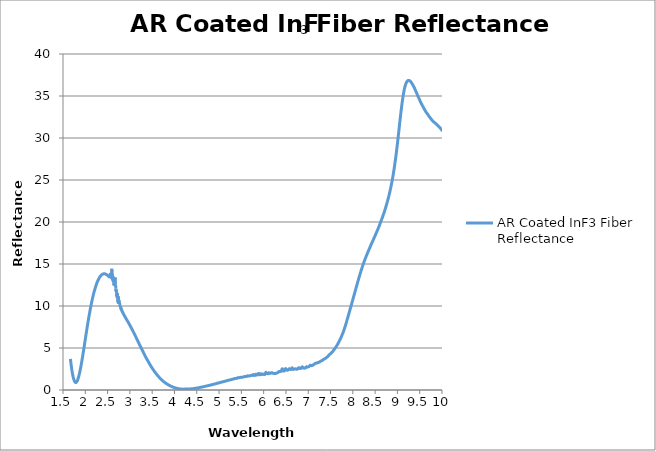
| Category | AR Coated InF3 Fiber Reflectance |
|---|---|
| 1.66628 | 3.701 |
| 1.6695 | 3.569 |
| 1.6727100000000001 | 3.409 |
| 1.6759300000000001 | 3.259 |
| 1.6791500000000001 | 3.143 |
| 1.6823599999999999 | 2.982 |
| 1.6855799999999999 | 2.879 |
| 1.6887999999999999 | 2.746 |
| 1.69201 | 2.619 |
| 1.69523 | 2.49 |
| 1.69845 | 2.388 |
| 1.7016600000000002 | 2.287 |
| 1.7048800000000002 | 2.175 |
| 1.7081 | 2.067 |
| 1.71132 | 1.975 |
| 1.7145299999999999 | 1.905 |
| 1.71775 | 1.801 |
| 1.72097 | 1.702 |
| 1.72418 | 1.633 |
| 1.7274 | 1.546 |
| 1.7306199999999998 | 1.501 |
| 1.73383 | 1.426 |
| 1.73705 | 1.347 |
| 1.74027 | 1.299 |
| 1.74348 | 1.248 |
| 1.7467000000000001 | 1.206 |
| 1.7499200000000001 | 1.151 |
| 1.75313 | 1.094 |
| 1.7563499999999999 | 1.063 |
| 1.7595699999999999 | 1.028 |
| 1.76278 | 0.995 |
| 1.766 | 0.966 |
| 1.76922 | 0.95 |
| 1.7724300000000002 | 0.932 |
| 1.7756500000000002 | 0.912 |
| 1.77887 | 0.912 |
| 1.7820799999999999 | 0.883 |
| 1.7852999999999999 | 0.899 |
| 1.7885199999999999 | 0.877 |
| 1.79173 | 0.906 |
| 1.79495 | 0.91 |
| 1.79817 | 0.922 |
| 1.8013800000000002 | 0.933 |
| 1.8046 | 0.943 |
| 1.80782 | 0.972 |
| 1.81103 | 1.008 |
| 1.81425 | 1.027 |
| 1.81747 | 1.056 |
| 1.82068 | 1.094 |
| 1.8239 | 1.133 |
| 1.8271199999999999 | 1.179 |
| 1.8303399999999999 | 1.22 |
| 1.83355 | 1.266 |
| 1.83677 | 1.327 |
| 1.83999 | 1.372 |
| 1.8432 | 1.424 |
| 1.8464200000000002 | 1.486 |
| 1.8496400000000002 | 1.552 |
| 1.8528499999999999 | 1.609 |
| 1.8560699999999999 | 1.682 |
| 1.8592899999999999 | 1.748 |
| 1.8625 | 1.811 |
| 1.86572 | 1.875 |
| 1.86894 | 1.962 |
| 1.87215 | 2.056 |
| 1.87537 | 2.113 |
| 1.87859 | 2.2 |
| 1.8818 | 2.272 |
| 1.88502 | 2.362 |
| 1.88824 | 2.437 |
| 1.89145 | 2.541 |
| 1.89467 | 2.603 |
| 1.89789 | 2.722 |
| 1.9011 | 2.811 |
| 1.90432 | 2.906 |
| 1.90754 | 2.992 |
| 1.91075 | 3.084 |
| 1.91397 | 3.191 |
| 1.91719 | 3.269 |
| 1.9204 | 3.41 |
| 1.9236199999999999 | 3.47 |
| 1.9268399999999999 | 3.58 |
| 1.93005 | 3.675 |
| 1.93327 | 3.78 |
| 1.93649 | 3.882 |
| 1.93971 | 3.994 |
| 1.94292 | 4.091 |
| 1.9461400000000002 | 4.19 |
| 1.94936 | 4.3 |
| 1.95257 | 4.415 |
| 1.95579 | 4.525 |
| 1.95901 | 4.626 |
| 1.96222 | 4.738 |
| 1.96544 | 4.85 |
| 1.96866 | 4.957 |
| 1.9718699999999998 | 5.081 |
| 1.97509 | 5.183 |
| 1.97831 | 5.285 |
| 1.98152 | 5.401 |
| 1.98474 | 5.511 |
| 1.98796 | 5.615 |
| 1.99117 | 5.737 |
| 1.99439 | 5.841 |
| 1.9976099999999999 | 5.956 |
| 2.00082 | 6.068 |
| 2.00404 | 6.178 |
| 2.00726 | 6.294 |
| 2.01047 | 6.41 |
| 2.01369 | 6.51 |
| 2.01691 | 6.612 |
| 2.02012 | 6.731 |
| 2.02334 | 6.845 |
| 2.02656 | 6.944 |
| 2.02977 | 7.058 |
| 2.03299 | 7.162 |
| 2.03621 | 7.264 |
| 2.0394200000000002 | 7.381 |
| 2.04264 | 7.496 |
| 2.04586 | 7.591 |
| 2.04907 | 7.699 |
| 2.05229 | 7.809 |
| 2.0555100000000004 | 7.896 |
| 2.05873 | 8.018 |
| 2.06194 | 8.113 |
| 2.0651599999999997 | 8.211 |
| 2.0683800000000003 | 8.318 |
| 2.07159 | 8.422 |
| 2.07481 | 8.518 |
| 2.07803 | 8.615 |
| 2.0812399999999998 | 8.719 |
| 2.08446 | 8.816 |
| 2.0876799999999998 | 8.915 |
| 2.09089 | 9.009 |
| 2.09411 | 9.106 |
| 2.09733 | 9.195 |
| 2.10054 | 9.296 |
| 2.1037600000000003 | 9.396 |
| 2.10698 | 9.486 |
| 2.1101900000000002 | 9.563 |
| 2.11341 | 9.67 |
| 2.1166300000000002 | 9.761 |
| 2.11984 | 9.853 |
| 2.1230599999999997 | 9.928 |
| 2.1262800000000004 | 10.018 |
| 2.1294899999999997 | 10.101 |
| 2.13271 | 10.188 |
| 2.1359299999999997 | 10.272 |
| 2.13914 | 10.358 |
| 2.14236 | 10.437 |
| 2.14558 | 10.514 |
| 2.14879 | 10.597 |
| 2.15201 | 10.675 |
| 2.15523 | 10.752 |
| 2.15844 | 10.832 |
| 2.16166 | 10.902 |
| 2.16488 | 10.979 |
| 2.1680900000000003 | 11.057 |
| 2.17131 | 11.134 |
| 2.1745300000000003 | 11.204 |
| 2.17775 | 11.274 |
| 2.1809600000000002 | 11.343 |
| 2.18418 | 11.405 |
| 2.1874000000000002 | 11.47 |
| 2.19061 | 11.542 |
| 2.1938299999999997 | 11.613 |
| 2.1970500000000004 | 11.669 |
| 2.20026 | 11.728 |
| 2.20348 | 11.802 |
| 2.2066999999999997 | 11.858 |
| 2.20991 | 11.924 |
| 2.21313 | 11.966 |
| 2.21635 | 12.027 |
| 2.21956 | 12.089 |
| 2.22278 | 12.138 |
| 2.226 | 12.201 |
| 2.22921 | 12.25 |
| 2.23243 | 12.31 |
| 2.23565 | 12.365 |
| 2.2388600000000003 | 12.412 |
| 2.24208 | 12.467 |
| 2.2453000000000003 | 12.512 |
| 2.24851 | 12.567 |
| 2.2517300000000002 | 12.612 |
| 2.25495 | 12.658 |
| 2.2581599999999997 | 12.706 |
| 2.26138 | 12.754 |
| 2.2645999999999997 | 12.801 |
| 2.26781 | 12.845 |
| 2.27103 | 12.883 |
| 2.27425 | 12.926 |
| 2.27746 | 12.966 |
| 2.28068 | 13.009 |
| 2.2839 | 13.044 |
| 2.28711 | 13.084 |
| 2.29033 | 13.117 |
| 2.29355 | 13.151 |
| 2.29677 | 13.182 |
| 2.29998 | 13.224 |
| 2.3032 | 13.254 |
| 2.30642 | 13.285 |
| 2.3096300000000003 | 13.313 |
| 2.31285 | 13.344 |
| 2.3160700000000003 | 13.365 |
| 2.31928 | 13.401 |
| 2.3225 | 13.431 |
| 2.32572 | 13.456 |
| 2.3289299999999997 | 13.481 |
| 2.33215 | 13.501 |
| 2.3353699999999997 | 13.531 |
| 2.33858 | 13.55 |
| 2.3418 | 13.569 |
| 2.34502 | 13.596 |
| 2.34823 | 13.61 |
| 2.35145 | 13.632 |
| 2.35467 | 13.649 |
| 2.35788 | 13.672 |
| 2.3611 | 13.688 |
| 2.36432 | 13.699 |
| 2.3675300000000004 | 13.711 |
| 2.37075 | 13.733 |
| 2.37397 | 13.743 |
| 2.3771799999999996 | 13.752 |
| 2.3804000000000003 | 13.766 |
| 2.38362 | 13.771 |
| 2.38683 | 13.784 |
| 2.39005 | 13.789 |
| 2.39327 | 13.798 |
| 2.39648 | 13.806 |
| 2.3996999999999997 | 13.815 |
| 2.40292 | 13.82 |
| 2.40613 | 13.821 |
| 2.40935 | 13.825 |
| 2.41257 | 13.835 |
| 2.41579 | 13.833 |
| 2.419 | 13.839 |
| 2.42222 | 13.84 |
| 2.42544 | 13.832 |
| 2.42865 | 13.834 |
| 2.43187 | 13.831 |
| 2.43509 | 13.832 |
| 2.4383000000000004 | 13.829 |
| 2.44152 | 13.824 |
| 2.44474 | 13.82 |
| 2.4479499999999996 | 13.813 |
| 2.4511700000000003 | 13.806 |
| 2.45439 | 13.796 |
| 2.4576 | 13.789 |
| 2.46082 | 13.785 |
| 2.46404 | 13.78 |
| 2.46725 | 13.766 |
| 2.4704699999999997 | 13.756 |
| 2.47369 | 13.754 |
| 2.4769 | 13.738 |
| 2.48012 | 13.728 |
| 2.48334 | 13.719 |
| 2.4865500000000003 | 13.709 |
| 2.48977 | 13.693 |
| 2.49299 | 13.676 |
| 2.4962 | 13.667 |
| 2.49942 | 13.641 |
| 2.50264 | 13.633 |
| 2.5058499999999997 | 13.623 |
| 2.5090700000000004 | 13.606 |
| 2.51229 | 13.583 |
| 2.5155 | 13.576 |
| 2.5187199999999996 | 13.564 |
| 2.52194 | 13.541 |
| 2.52515 | 13.528 |
| 2.52837 | 13.506 |
| 2.53159 | 13.55 |
| 2.53481 | 13.558 |
| 2.53802 | 13.501 |
| 2.5412399999999997 | 13.482 |
| 2.54446 | 13.543 |
| 2.54767 | 13.5 |
| 2.55089 | 13.538 |
| 2.55411 | 13.469 |
| 2.5573200000000003 | 13.308 |
| 2.56054 | 13.712 |
| 2.5637600000000003 | 13.943 |
| 2.56697 | 13.463 |
| 2.57019 | 13.562 |
| 2.57341 | 13.667 |
| 2.5766199999999997 | 13.58 |
| 2.5798400000000004 | 13.399 |
| 2.58306 | 13.732 |
| 2.58627 | 13.711 |
| 2.5894899999999996 | 13.451 |
| 2.59271 | 13.685 |
| 2.59592 | 14.429 |
| 2.59914 | 13.191 |
| 2.60236 | 13.358 |
| 2.60557 | 13.821 |
| 2.60879 | 13.426 |
| 2.61201 | 13.075 |
| 2.61522 | 13.259 |
| 2.61844 | 13.577 |
| 2.62166 | 13.221 |
| 2.62487 | 12.901 |
| 2.6280900000000003 | 13.229 |
| 2.63131 | 13.319 |
| 2.63452 | 12.831 |
| 2.63774 | 12.492 |
| 2.64096 | 12.469 |
| 2.64418 | 12.535 |
| 2.6473899999999997 | 12.484 |
| 2.65061 | 12.428 |
| 2.65383 | 12.602 |
| 2.65704 | 12.436 |
| 2.66026 | 12.508 |
| 2.66348 | 12.755 |
| 2.66669 | 13.401 |
| 2.66991 | 13.318 |
| 2.67313 | 12.654 |
| 2.67634 | 12.703 |
| 2.67956 | 12.565 |
| 2.68278 | 12.065 |
| 2.68599 | 11.972 |
| 2.68921 | 11.744 |
| 2.69243 | 11.876 |
| 2.69564 | 11.987 |
| 2.6988600000000003 | 11.491 |
| 2.70208 | 11.399 |
| 2.7052899999999998 | 11.179 |
| 2.7085100000000004 | 11.418 |
| 2.71173 | 11.538 |
| 2.71494 | 10.936 |
| 2.7181599999999997 | 11.111 |
| 2.72138 | 11.537 |
| 2.72459 | 11.294 |
| 2.72781 | 10.688 |
| 2.73103 | 10.428 |
| 2.73424 | 10.591 |
| 2.73746 | 10.797 |
| 2.74068 | 11.171 |
| 2.74389 | 10.549 |
| 2.74711 | 10.236 |
| 2.75033 | 10.24 |
| 2.75354 | 10.541 |
| 2.7567600000000003 | 10.721 |
| 2.75998 | 10.264 |
| 2.7632 | 10.402 |
| 2.76641 | 10.332 |
| 2.7696300000000003 | 10.328 |
| 2.77285 | 10.162 |
| 2.7760599999999998 | 9.969 |
| 2.7792800000000004 | 9.974 |
| 2.7825 | 9.959 |
| 2.78571 | 10.017 |
| 2.7889299999999997 | 10.005 |
| 2.79215 | 9.761 |
| 2.79536 | 9.694 |
| 2.79858 | 9.667 |
| 2.8018 | 9.811 |
| 2.8050100000000002 | 9.826 |
| 2.80823 | 9.608 |
| 2.81145 | 9.518 |
| 2.81466 | 9.516 |
| 2.81788 | 9.512 |
| 2.8211 | 9.49 |
| 2.82431 | 9.382 |
| 2.8275300000000003 | 9.343 |
| 2.83075 | 9.307 |
| 2.8339600000000003 | 9.316 |
| 2.83718 | 9.296 |
| 2.8404000000000003 | 9.228 |
| 2.84361 | 9.162 |
| 2.8468299999999997 | 9.141 |
| 2.85005 | 9.134 |
| 2.85326 | 9.113 |
| 2.85648 | 9.072 |
| 2.8596999999999997 | 9.017 |
| 2.86291 | 8.978 |
| 2.86613 | 8.953 |
| 2.86935 | 8.929 |
| 2.87256 | 8.905 |
| 2.8757800000000002 | 8.855 |
| 2.879 | 8.824 |
| 2.88222 | 8.798 |
| 2.88543 | 8.775 |
| 2.88865 | 8.746 |
| 2.89187 | 8.704 |
| 2.89508 | 8.672 |
| 2.8983000000000003 | 8.658 |
| 2.90152 | 8.65 |
| 2.90473 | 8.604 |
| 2.90795 | 8.558 |
| 2.9111700000000003 | 8.524 |
| 2.91438 | 8.496 |
| 2.9175999999999997 | 8.466 |
| 2.92082 | 8.447 |
| 2.92403 | 8.426 |
| 2.92725 | 8.384 |
| 2.9304699999999997 | 8.351 |
| 2.93368 | 8.327 |
| 2.9369 | 8.299 |
| 2.94012 | 8.272 |
| 2.94333 | 8.244 |
| 2.9465500000000002 | 8.214 |
| 2.94977 | 8.181 |
| 2.95298 | 8.152 |
| 2.9562 | 8.127 |
| 2.95942 | 8.093 |
| 2.9626300000000003 | 8.061 |
| 2.96585 | 8.032 |
| 2.9690700000000003 | 8.007 |
| 2.97228 | 7.981 |
| 2.9755 | 7.95 |
| 2.9787199999999996 | 7.918 |
| 2.9819299999999997 | 7.885 |
| 2.98515 | 7.852 |
| 2.9883699999999997 | 7.818 |
| 2.99158 | 7.785 |
| 2.9948 | 7.759 |
| 2.99802 | 7.731 |
| 3.0012399999999997 | 7.695 |
| 3.00445 | 7.662 |
| 3.00767 | 7.629 |
| 3.01089 | 7.597 |
| 3.0141 | 7.568 |
| 3.0173200000000002 | 7.541 |
| 3.02054 | 7.511 |
| 3.02375 | 7.478 |
| 3.02697 | 7.441 |
| 3.03019 | 7.41 |
| 3.0334 | 7.381 |
| 3.03662 | 7.347 |
| 3.0398400000000003 | 7.31 |
| 3.04305 | 7.274 |
| 3.04627 | 7.243 |
| 3.0494899999999996 | 7.214 |
| 3.0526999999999997 | 7.183 |
| 3.05592 | 7.151 |
| 3.0591399999999997 | 7.113 |
| 3.06235 | 7.075 |
| 3.06557 | 7.037 |
| 3.06879 | 7.006 |
| 3.072 | 6.976 |
| 3.07522 | 6.939 |
| 3.07844 | 6.906 |
| 3.0816500000000002 | 6.878 |
| 3.08487 | 6.84 |
| 3.0880900000000002 | 6.804 |
| 3.0913000000000004 | 6.772 |
| 3.09452 | 6.74 |
| 3.09774 | 6.705 |
| 3.1009499999999997 | 6.665 |
| 3.10417 | 6.633 |
| 3.1073899999999997 | 6.605 |
| 3.1106 | 6.57 |
| 3.11382 | 6.532 |
| 3.11704 | 6.493 |
| 3.12026 | 6.458 |
| 3.1234699999999997 | 6.428 |
| 3.12669 | 6.398 |
| 3.1299099999999997 | 6.362 |
| 3.13312 | 6.324 |
| 3.13634 | 6.288 |
| 3.13956 | 6.251 |
| 3.14277 | 6.213 |
| 3.14599 | 6.184 |
| 3.14921 | 6.151 |
| 3.15242 | 6.112 |
| 3.15564 | 6.078 |
| 3.1588600000000002 | 6.044 |
| 3.1620700000000004 | 6.005 |
| 3.16529 | 5.968 |
| 3.1685100000000004 | 5.937 |
| 3.1717199999999997 | 5.902 |
| 3.17494 | 5.863 |
| 3.1781599999999997 | 5.824 |
| 3.18137 | 5.788 |
| 3.18459 | 5.755 |
| 3.18781 | 5.723 |
| 3.19102 | 5.694 |
| 3.1942399999999997 | 5.66 |
| 3.19746 | 5.62 |
| 3.20067 | 5.584 |
| 3.20389 | 5.552 |
| 3.20711 | 5.517 |
| 3.2103200000000003 | 5.474 |
| 3.21354 | 5.434 |
| 3.2167600000000003 | 5.398 |
| 3.21997 | 5.361 |
| 3.22319 | 5.329 |
| 3.22641 | 5.3 |
| 3.2296199999999997 | 5.266 |
| 3.23284 | 5.226 |
| 3.23606 | 5.187 |
| 3.2392800000000004 | 5.151 |
| 3.2424899999999997 | 5.117 |
| 3.24571 | 5.084 |
| 3.2489299999999997 | 5.047 |
| 3.25214 | 5.011 |
| 3.25536 | 4.98 |
| 3.25858 | 4.948 |
| 3.26179 | 4.914 |
| 3.26501 | 4.876 |
| 3.26823 | 4.839 |
| 3.27144 | 4.803 |
| 3.27466 | 4.765 |
| 3.27788 | 4.731 |
| 3.2810900000000003 | 4.697 |
| 3.28431 | 4.662 |
| 3.2875300000000003 | 4.628 |
| 3.29074 | 4.595 |
| 3.29396 | 4.563 |
| 3.29718 | 4.529 |
| 3.3003899999999997 | 4.492 |
| 3.30361 | 4.454 |
| 3.3068299999999997 | 4.417 |
| 3.31004 | 4.385 |
| 3.31326 | 4.358 |
| 3.31648 | 4.327 |
| 3.31969 | 4.293 |
| 3.32291 | 4.259 |
| 3.32613 | 4.222 |
| 3.32934 | 4.182 |
| 3.33256 | 4.146 |
| 3.33578 | 4.114 |
| 3.33899 | 4.08 |
| 3.34221 | 4.044 |
| 3.34543 | 4.011 |
| 3.34864 | 3.98 |
| 3.3518600000000003 | 3.946 |
| 3.35508 | 3.913 |
| 3.3583000000000003 | 3.882 |
| 3.36151 | 3.85 |
| 3.36473 | 3.816 |
| 3.36795 | 3.785 |
| 3.3711599999999997 | 3.759 |
| 3.37438 | 3.735 |
| 3.3775999999999997 | 3.712 |
| 3.38081 | 3.686 |
| 3.38403 | 3.656 |
| 3.38725 | 3.622 |
| 3.39046 | 3.586 |
| 3.39368 | 3.551 |
| 3.3969 | 3.519 |
| 3.40011 | 3.487 |
| 3.40333 | 3.456 |
| 3.40655 | 3.429 |
| 3.4097600000000003 | 3.401 |
| 3.41298 | 3.372 |
| 3.4162 | 3.345 |
| 3.41941 | 3.318 |
| 3.4226300000000003 | 3.288 |
| 3.42585 | 3.254 |
| 3.4290599999999998 | 3.22 |
| 3.43228 | 3.189 |
| 3.4355 | 3.16 |
| 3.43871 | 3.132 |
| 3.4419299999999997 | 3.105 |
| 3.44515 | 3.075 |
| 3.44836 | 3.042 |
| 3.45158 | 3.013 |
| 3.4548 | 2.989 |
| 3.4580100000000003 | 2.962 |
| 3.46123 | 2.93 |
| 3.46445 | 2.902 |
| 3.46767 | 2.876 |
| 3.47088 | 2.848 |
| 3.4741 | 2.819 |
| 3.47732 | 2.793 |
| 3.4805300000000003 | 2.767 |
| 3.48375 | 2.74 |
| 3.48697 | 2.713 |
| 3.4901799999999996 | 2.685 |
| 3.4934000000000003 | 2.659 |
| 3.49662 | 2.636 |
| 3.4998299999999998 | 2.61 |
| 3.50305 | 2.582 |
| 3.5062699999999998 | 2.556 |
| 3.50948 | 2.53 |
| 3.5126999999999997 | 2.504 |
| 3.51592 | 2.48 |
| 3.51913 | 2.457 |
| 3.52235 | 2.43 |
| 3.52557 | 2.404 |
| 3.5287800000000002 | 2.378 |
| 3.532 | 2.351 |
| 3.53522 | 2.326 |
| 3.53843 | 2.304 |
| 3.54165 | 2.282 |
| 3.54487 | 2.257 |
| 3.54808 | 2.234 |
| 3.5513000000000003 | 2.211 |
| 3.55452 | 2.188 |
| 3.55773 | 2.162 |
| 3.5609499999999996 | 2.137 |
| 3.5641700000000003 | 2.114 |
| 3.56738 | 2.094 |
| 3.5705999999999998 | 2.071 |
| 3.57382 | 2.047 |
| 3.57703 | 2.027 |
| 3.58025 | 2.006 |
| 3.5834699999999997 | 1.98 |
| 3.58669 | 1.957 |
| 3.5899 | 1.936 |
| 3.59312 | 1.916 |
| 3.59634 | 1.895 |
| 3.5995500000000002 | 1.873 |
| 3.60277 | 1.852 |
| 3.60599 | 1.831 |
| 3.6092 | 1.81 |
| 3.61242 | 1.788 |
| 3.61564 | 1.765 |
| 3.61885 | 1.745 |
| 3.6220700000000003 | 1.725 |
| 3.62529 | 1.705 |
| 3.6285 | 1.686 |
| 3.6317199999999996 | 1.667 |
| 3.63494 | 1.646 |
| 3.63815 | 1.626 |
| 3.6413699999999998 | 1.608 |
| 3.64459 | 1.589 |
| 3.6478 | 1.568 |
| 3.65102 | 1.548 |
| 3.6542399999999997 | 1.528 |
| 3.65745 | 1.508 |
| 3.66067 | 1.491 |
| 3.66389 | 1.474 |
| 3.6671 | 1.455 |
| 3.6703200000000002 | 1.437 |
| 3.67354 | 1.419 |
| 3.67675 | 1.401 |
| 3.67997 | 1.384 |
| 3.68319 | 1.369 |
| 3.6864 | 1.351 |
| 3.6896199999999997 | 1.331 |
| 3.6928400000000003 | 1.314 |
| 3.69605 | 1.3 |
| 3.69927 | 1.286 |
| 3.7024899999999996 | 1.269 |
| 3.70571 | 1.251 |
| 3.70892 | 1.232 |
| 3.7121399999999998 | 1.214 |
| 3.71536 | 1.194 |
| 3.71857 | 1.176 |
| 3.72179 | 1.161 |
| 3.72501 | 1.148 |
| 3.72822 | 1.135 |
| 3.73144 | 1.12 |
| 3.73466 | 1.104 |
| 3.73787 | 1.089 |
| 3.7410900000000002 | 1.075 |
| 3.74431 | 1.061 |
| 3.74752 | 1.046 |
| 3.75074 | 1.032 |
| 3.75396 | 1.02 |
| 3.75717 | 1.005 |
| 3.7603899999999997 | 0.988 |
| 3.7636100000000003 | 0.972 |
| 3.76682 | 0.959 |
| 3.77004 | 0.948 |
| 3.77326 | 0.938 |
| 3.7764699999999998 | 0.925 |
| 3.77969 | 0.909 |
| 3.7829099999999998 | 0.894 |
| 3.78612 | 0.883 |
| 3.78934 | 0.871 |
| 3.79256 | 0.857 |
| 3.79577 | 0.843 |
| 3.79899 | 0.831 |
| 3.80221 | 0.819 |
| 3.8054200000000002 | 0.808 |
| 3.80864 | 0.797 |
| 3.8118600000000002 | 0.786 |
| 3.81507 | 0.774 |
| 3.81829 | 0.761 |
| 3.8215100000000004 | 0.748 |
| 3.82473 | 0.736 |
| 3.82794 | 0.725 |
| 3.8311599999999997 | 0.714 |
| 3.83438 | 0.703 |
| 3.83759 | 0.691 |
| 3.84081 | 0.679 |
| 3.84403 | 0.67 |
| 3.8472399999999998 | 0.662 |
| 3.85046 | 0.653 |
| 3.8536799999999998 | 0.644 |
| 3.85689 | 0.635 |
| 3.86011 | 0.625 |
| 3.86333 | 0.615 |
| 3.86654 | 0.603 |
| 3.8697600000000003 | 0.592 |
| 3.87298 | 0.581 |
| 3.8761900000000002 | 0.571 |
| 3.87941 | 0.561 |
| 3.8826300000000002 | 0.553 |
| 3.88584 | 0.544 |
| 3.8890599999999997 | 0.536 |
| 3.8922800000000004 | 0.529 |
| 3.8954899999999997 | 0.521 |
| 3.89871 | 0.512 |
| 3.9019299999999997 | 0.501 |
| 3.90514 | 0.489 |
| 3.90836 | 0.479 |
| 3.91158 | 0.47 |
| 3.91479 | 0.462 |
| 3.91801 | 0.454 |
| 3.92123 | 0.448 |
| 3.92444 | 0.444 |
| 3.92766 | 0.437 |
| 3.93088 | 0.427 |
| 3.9340900000000003 | 0.416 |
| 3.93731 | 0.408 |
| 3.9405300000000003 | 0.401 |
| 3.94375 | 0.394 |
| 3.9469600000000002 | 0.388 |
| 3.95018 | 0.381 |
| 3.9534000000000002 | 0.374 |
| 3.95661 | 0.367 |
| 3.9598299999999997 | 0.361 |
| 3.96305 | 0.354 |
| 3.96626 | 0.346 |
| 3.96948 | 0.339 |
| 3.9726999999999997 | 0.333 |
| 3.97591 | 0.328 |
| 3.97913 | 0.323 |
| 3.98235 | 0.315 |
| 3.98556 | 0.307 |
| 3.98878 | 0.298 |
| 3.992 | 0.292 |
| 3.99521 | 0.287 |
| 3.99843 | 0.284 |
| 4.00165 | 0.281 |
| 4.00486 | 0.276 |
| 4.00808 | 0.27 |
| 4.0113 | 0.263 |
| 4.0145100000000005 | 0.258 |
| 4.01773 | 0.255 |
| 4.02095 | 0.251 |
| 4.02416 | 0.245 |
| 4.02738 | 0.236 |
| 4.0306 | 0.228 |
| 4.03381 | 0.224 |
| 4.037030000000001 | 0.22 |
| 4.04025 | 0.216 |
| 4.04346 | 0.212 |
| 4.04668 | 0.208 |
| 4.0499 | 0.204 |
| 4.05311 | 0.2 |
| 4.05633 | 0.197 |
| 4.05955 | 0.193 |
| 4.0627699999999995 | 0.19 |
| 4.06598 | 0.187 |
| 4.0691999999999995 | 0.182 |
| 4.07242 | 0.176 |
| 4.07563 | 0.173 |
| 4.07885 | 0.17 |
| 4.08207 | 0.165 |
| 4.08528 | 0.161 |
| 4.0885 | 0.159 |
| 4.09172 | 0.157 |
| 4.09493 | 0.155 |
| 4.0981499999999995 | 0.151 |
| 4.10137 | 0.145 |
| 4.10458 | 0.141 |
| 4.1078 | 0.137 |
| 4.111020000000001 | 0.135 |
| 4.114229999999999 | 0.133 |
| 4.11745 | 0.131 |
| 4.1206700000000005 | 0.129 |
| 4.12388 | 0.127 |
| 4.1271 | 0.124 |
| 4.130319999999999 | 0.122 |
| 4.1335299999999995 | 0.121 |
| 4.13675 | 0.119 |
| 4.13997 | 0.117 |
| 4.14318 | 0.115 |
| 4.1464 | 0.114 |
| 4.14962 | 0.114 |
| 4.15283 | 0.114 |
| 4.1560500000000005 | 0.114 |
| 4.15927 | 0.114 |
| 4.1624799999999995 | 0.113 |
| 4.1657 | 0.109 |
| 4.16892 | 0.106 |
| 4.172140000000001 | 0.103 |
| 4.175350000000001 | 0.103 |
| 4.17857 | 0.103 |
| 4.18179 | 0.103 |
| 4.185 | 0.103 |
| 4.18822 | 0.101 |
| 4.191439999999999 | 0.101 |
| 4.194649999999999 | 0.101 |
| 4.19787 | 0.101 |
| 4.20109 | 0.1 |
| 4.2043 | 0.1 |
| 4.207520000000001 | 0.1 |
| 4.2107399999999995 | 0.102 |
| 4.21395 | 0.105 |
| 4.21717 | 0.108 |
| 4.22039 | 0.112 |
| 4.2236 | 0.114 |
| 4.22682 | 0.114 |
| 4.23004 | 0.115 |
| 4.23325 | 0.116 |
| 4.236470000000001 | 0.118 |
| 4.2396899999999995 | 0.12 |
| 4.2429 | 0.119 |
| 4.2461199999999995 | 0.115 |
| 4.24934 | 0.109 |
| 4.25255 | 0.103 |
| 4.25577 | 0.099 |
| 4.25899 | 0.1 |
| 4.2622 | 0.103 |
| 4.26542 | 0.109 |
| 4.26864 | 0.113 |
| 4.271850000000001 | 0.116 |
| 4.2750699999999995 | 0.115 |
| 4.27829 | 0.114 |
| 4.2815 | 0.112 |
| 4.28472 | 0.111 |
| 4.28794 | 0.113 |
| 4.29116 | 0.115 |
| 4.29437 | 0.117 |
| 4.2975900000000005 | 0.118 |
| 4.30081 | 0.117 |
| 4.30402 | 0.115 |
| 4.30724 | 0.116 |
| 4.31046 | 0.117 |
| 4.31367 | 0.118 |
| 4.31689 | 0.119 |
| 4.32011 | 0.12 |
| 4.32332 | 0.122 |
| 4.32654 | 0.122 |
| 4.32976 | 0.122 |
| 4.33297 | 0.122 |
| 4.336189999999999 | 0.122 |
| 4.33941 | 0.123 |
| 4.34262 | 0.122 |
| 4.34584 | 0.121 |
| 4.349060000000001 | 0.123 |
| 4.352270000000001 | 0.125 |
| 4.35549 | 0.128 |
| 4.35871 | 0.129 |
| 4.3619200000000005 | 0.131 |
| 4.36514 | 0.132 |
| 4.36836 | 0.134 |
| 4.371569999999999 | 0.137 |
| 4.37479 | 0.139 |
| 4.378010000000001 | 0.14 |
| 4.38122 | 0.141 |
| 4.38444 | 0.143 |
| 4.3876599999999994 | 0.146 |
| 4.39087 | 0.149 |
| 4.39409 | 0.152 |
| 4.39731 | 0.153 |
| 4.40052 | 0.154 |
| 4.40374 | 0.155 |
| 4.40696 | 0.156 |
| 4.41018 | 0.158 |
| 4.413390000000001 | 0.16 |
| 4.4166099999999995 | 0.161 |
| 4.41983 | 0.161 |
| 4.42304 | 0.162 |
| 4.42626 | 0.162 |
| 4.42948 | 0.164 |
| 4.43269 | 0.166 |
| 4.43591 | 0.17 |
| 4.4391300000000005 | 0.173 |
| 4.44234 | 0.176 |
| 4.44556 | 0.18 |
| 4.44878 | 0.184 |
| 4.4519899999999994 | 0.188 |
| 4.45521 | 0.192 |
| 4.45843 | 0.195 |
| 4.46164 | 0.196 |
| 4.46486 | 0.197 |
| 4.46808 | 0.199 |
| 4.47129 | 0.201 |
| 4.47451 | 0.204 |
| 4.477729999999999 | 0.208 |
| 4.4809399999999995 | 0.211 |
| 4.48416 | 0.212 |
| 4.48738 | 0.214 |
| 4.49059 | 0.217 |
| 4.493810000000001 | 0.221 |
| 4.49703 | 0.224 |
| 4.50024 | 0.226 |
| 4.5034600000000005 | 0.229 |
| 4.50668 | 0.232 |
| 4.50989 | 0.236 |
| 4.513109999999999 | 0.24 |
| 4.51633 | 0.244 |
| 4.51954 | 0.248 |
| 4.52276 | 0.251 |
| 4.52598 | 0.253 |
| 4.5291999999999994 | 0.256 |
| 4.53241 | 0.259 |
| 4.53563 | 0.263 |
| 4.53885 | 0.267 |
| 4.54206 | 0.269 |
| 4.54528 | 0.272 |
| 4.5485 | 0.274 |
| 4.55171 | 0.277 |
| 4.554930000000001 | 0.28 |
| 4.5581499999999995 | 0.284 |
| 4.56136 | 0.288 |
| 4.56458 | 0.291 |
| 4.5678 | 0.296 |
| 4.57101 | 0.301 |
| 4.574229999999999 | 0.307 |
| 4.57745 | 0.312 |
| 4.58066 | 0.316 |
| 4.58388 | 0.318 |
| 4.5871 | 0.319 |
| 4.590310000000001 | 0.322 |
| 4.5935299999999994 | 0.326 |
| 4.59675 | 0.332 |
| 4.59996 | 0.336 |
| 4.60318 | 0.34 |
| 4.6064 | 0.343 |
| 4.60961 | 0.346 |
| 4.61283 | 0.348 |
| 4.61605 | 0.35 |
| 4.619260000000001 | 0.353 |
| 4.6224799999999995 | 0.357 |
| 4.6257 | 0.361 |
| 4.628909999999999 | 0.364 |
| 4.63213 | 0.367 |
| 4.635350000000001 | 0.371 |
| 4.63856 | 0.375 |
| 4.64178 | 0.38 |
| 4.645 | 0.384 |
| 4.64822 | 0.389 |
| 4.65143 | 0.393 |
| 4.654649999999999 | 0.398 |
| 4.65787 | 0.401 |
| 4.66108 | 0.405 |
| 4.6643 | 0.408 |
| 4.667520000000001 | 0.412 |
| 4.67073 | 0.416 |
| 4.67395 | 0.42 |
| 4.67717 | 0.423 |
| 4.68038 | 0.427 |
| 4.6836 | 0.43 |
| 4.68682 | 0.434 |
| 4.69003 | 0.439 |
| 4.69325 | 0.444 |
| 4.696470000000001 | 0.449 |
| 4.69968 | 0.454 |
| 4.7029 | 0.459 |
| 4.70612 | 0.464 |
| 4.70933 | 0.469 |
| 4.71255 | 0.474 |
| 4.71577 | 0.478 |
| 4.718979999999999 | 0.481 |
| 4.7222 | 0.483 |
| 4.72542 | 0.485 |
| 4.72863 | 0.488 |
| 4.7318500000000006 | 0.491 |
| 4.7350699999999994 | 0.496 |
| 4.73828 | 0.501 |
| 4.7415 | 0.506 |
| 4.74472 | 0.511 |
| 4.74793 | 0.515 |
| 4.75115 | 0.518 |
| 4.75437 | 0.521 |
| 4.75758 | 0.523 |
| 4.760800000000001 | 0.528 |
| 4.76402 | 0.532 |
| 4.76724 | 0.537 |
| 4.770449999999999 | 0.542 |
| 4.77367 | 0.545 |
| 4.776890000000001 | 0.549 |
| 4.7801 | 0.552 |
| 4.78332 | 0.555 |
| 4.78654 | 0.559 |
| 4.78975 | 0.562 |
| 4.79297 | 0.566 |
| 4.796189999999999 | 0.57 |
| 4.7993999999999994 | 0.576 |
| 4.80262 | 0.582 |
| 4.80584 | 0.587 |
| 4.80905 | 0.59 |
| 4.812270000000001 | 0.594 |
| 4.81549 | 0.597 |
| 4.8187 | 0.601 |
| 4.82192 | 0.607 |
| 4.82514 | 0.612 |
| 4.82835 | 0.617 |
| 4.83157 | 0.621 |
| 4.83479 | 0.624 |
| 4.838 | 0.628 |
| 4.84122 | 0.632 |
| 4.84444 | 0.636 |
| 4.84765 | 0.641 |
| 4.85087 | 0.647 |
| 4.85409 | 0.652 |
| 4.8573 | 0.656 |
| 4.86052 | 0.66 |
| 4.86374 | 0.662 |
| 4.86695 | 0.665 |
| 4.87017 | 0.669 |
| 4.8733900000000006 | 0.673 |
| 4.8766099999999994 | 0.678 |
| 4.87982 | 0.683 |
| 4.88304 | 0.688 |
| 4.88626 | 0.694 |
| 4.88947 | 0.7 |
| 4.89269 | 0.705 |
| 4.89591 | 0.71 |
| 4.89912 | 0.714 |
| 4.902340000000001 | 0.717 |
| 4.90556 | 0.721 |
| 4.9087700000000005 | 0.725 |
| 4.911989999999999 | 0.73 |
| 4.91521 | 0.735 |
| 4.91842 | 0.741 |
| 4.92164 | 0.747 |
| 4.92486 | 0.752 |
| 4.92807 | 0.756 |
| 4.93129 | 0.759 |
| 4.93451 | 0.761 |
| 4.9377200000000006 | 0.764 |
| 4.940939999999999 | 0.768 |
| 4.94416 | 0.774 |
| 4.94737 | 0.781 |
| 4.95059 | 0.788 |
| 4.953810000000001 | 0.794 |
| 4.957020000000001 | 0.799 |
| 4.96024 | 0.804 |
| 4.96346 | 0.808 |
| 4.96667 | 0.813 |
| 4.96989 | 0.817 |
| 4.973109999999999 | 0.822 |
| 4.976319999999999 | 0.826 |
| 4.97954 | 0.829 |
| 4.98276 | 0.832 |
| 4.98597 | 0.835 |
| 4.98919 | 0.84 |
| 4.99241 | 0.844 |
| 4.99563 | 0.849 |
| 4.99884 | 0.854 |
| 5.00206 | 0.858 |
| 5.00528 | 0.862 |
| 5.00849 | 0.866 |
| 5.01171 | 0.871 |
| 5.0149300000000006 | 0.877 |
| 5.018140000000001 | 0.883 |
| 5.02136 | 0.889 |
| 5.02458 | 0.893 |
| 5.0277899999999995 | 0.897 |
| 5.03101 | 0.901 |
| 5.03423 | 0.906 |
| 5.037439999999999 | 0.912 |
| 5.04066 | 0.918 |
| 5.04388 | 0.922 |
| 5.04709 | 0.925 |
| 5.0503100000000005 | 0.928 |
| 5.053529999999999 | 0.931 |
| 5.05674 | 0.935 |
| 5.05996 | 0.939 |
| 5.06318 | 0.944 |
| 5.06639 | 0.949 |
| 5.06961 | 0.955 |
| 5.07283 | 0.962 |
| 5.07604 | 0.969 |
| 5.0792600000000006 | 0.974 |
| 5.082479999999999 | 0.978 |
| 5.08569 | 0.981 |
| 5.08891 | 0.983 |
| 5.09213 | 0.987 |
| 5.09534 | 0.99 |
| 5.09856 | 0.995 |
| 5.10178 | 1 |
| 5.10499 | 1.005 |
| 5.10821 | 1.009 |
| 5.11143 | 1.014 |
| 5.114649999999999 | 1.019 |
| 5.117859999999999 | 1.024 |
| 5.12108 | 1.029 |
| 5.1243 | 1.033 |
| 5.12751 | 1.037 |
| 5.13073 | 1.041 |
| 5.13395 | 1.045 |
| 5.13716 | 1.051 |
| 5.14038 | 1.057 |
| 5.1436 | 1.063 |
| 5.14681 | 1.068 |
| 5.15003 | 1.072 |
| 5.15325 | 1.074 |
| 5.15646 | 1.077 |
| 5.159680000000001 | 1.08 |
| 5.1629 | 1.085 |
| 5.16611 | 1.09 |
| 5.1693299999999995 | 1.096 |
| 5.17255 | 1.101 |
| 5.17576 | 1.105 |
| 5.178979999999999 | 1.109 |
| 5.1822 | 1.113 |
| 5.18541 | 1.117 |
| 5.18863 | 1.122 |
| 5.1918500000000005 | 1.128 |
| 5.195060000000001 | 1.133 |
| 5.19828 | 1.138 |
| 5.2015 | 1.144 |
| 5.20471 | 1.149 |
| 5.20793 | 1.155 |
| 5.21115 | 1.16 |
| 5.21436 | 1.165 |
| 5.21758 | 1.169 |
| 5.2208000000000006 | 1.171 |
| 5.22401 | 1.175 |
| 5.22723 | 1.178 |
| 5.230449999999999 | 1.183 |
| 5.23367 | 1.188 |
| 5.23688 | 1.193 |
| 5.2401 | 1.198 |
| 5.24332 | 1.202 |
| 5.24653 | 1.206 |
| 5.24975 | 1.21 |
| 5.25297 | 1.215 |
| 5.2561800000000005 | 1.219 |
| 5.259399999999999 | 1.224 |
| 5.26262 | 1.228 |
| 5.26583 | 1.232 |
| 5.26905 | 1.236 |
| 5.272270000000001 | 1.24 |
| 5.27548 | 1.244 |
| 5.2787 | 1.248 |
| 5.28192 | 1.252 |
| 5.2851300000000005 | 1.257 |
| 5.28835 | 1.263 |
| 5.29157 | 1.269 |
| 5.294779999999999 | 1.274 |
| 5.298 | 1.278 |
| 5.30122 | 1.282 |
| 5.30443 | 1.285 |
| 5.30765 | 1.288 |
| 5.3108699999999995 | 1.292 |
| 5.31408 | 1.296 |
| 5.3173 | 1.3 |
| 5.32052 | 1.303 |
| 5.323729999999999 | 1.307 |
| 5.32695 | 1.311 |
| 5.33017 | 1.315 |
| 5.33338 | 1.32 |
| 5.336600000000001 | 1.328 |
| 5.33982 | 1.337 |
| 5.34303 | 1.349 |
| 5.34625 | 1.361 |
| 5.34947 | 1.37 |
| 5.35269 | 1.376 |
| 5.355899999999999 | 1.376 |
| 5.35912 | 1.372 |
| 5.3623400000000006 | 1.367 |
| 5.36555 | 1.365 |
| 5.3687700000000005 | 1.364 |
| 5.371989999999999 | 1.367 |
| 5.3751999999999995 | 1.37 |
| 5.37842 | 1.375 |
| 5.38164 | 1.379 |
| 5.38485 | 1.383 |
| 5.38807 | 1.388 |
| 5.39129 | 1.392 |
| 5.3945 | 1.396 |
| 5.3977200000000005 | 1.4 |
| 5.400939999999999 | 1.405 |
| 5.40415 | 1.412 |
| 5.40737 | 1.42 |
| 5.41059 | 1.432 |
| 5.4138 | 1.445 |
| 5.417020000000001 | 1.459 |
| 5.42024 | 1.468 |
| 5.42345 | 1.473 |
| 5.42667 | 1.469 |
| 5.42989 | 1.462 |
| 5.4331000000000005 | 1.454 |
| 5.436319999999999 | 1.448 |
| 5.43954 | 1.446 |
| 5.44275 | 1.447 |
| 5.44597 | 1.451 |
| 5.44919 | 1.457 |
| 5.4524 | 1.464 |
| 5.45562 | 1.474 |
| 5.45884 | 1.485 |
| 5.4620500000000005 | 1.495 |
| 5.46527 | 1.502 |
| 5.46849 | 1.507 |
| 5.47171 | 1.509 |
| 5.47492 | 1.509 |
| 5.478140000000001 | 1.508 |
| 5.48136 | 1.507 |
| 5.48457 | 1.504 |
| 5.48779 | 1.502 |
| 5.49101 | 1.5 |
| 5.49422 | 1.499 |
| 5.497439999999999 | 1.5 |
| 5.50066 | 1.503 |
| 5.50387 | 1.506 |
| 5.50709 | 1.511 |
| 5.5103100000000005 | 1.516 |
| 5.513520000000001 | 1.521 |
| 5.5167399999999995 | 1.527 |
| 5.51996 | 1.531 |
| 5.52317 | 1.535 |
| 5.52639 | 1.536 |
| 5.52961 | 1.536 |
| 5.53282 | 1.535 |
| 5.53604 | 1.536 |
| 5.5392600000000005 | 1.537 |
| 5.542470000000001 | 1.542 |
| 5.54569 | 1.548 |
| 5.54891 | 1.555 |
| 5.5521199999999995 | 1.562 |
| 5.55534 | 1.566 |
| 5.558560000000001 | 1.57 |
| 5.56177 | 1.574 |
| 5.56499 | 1.579 |
| 5.56821 | 1.589 |
| 5.57142 | 1.6 |
| 5.5746400000000005 | 1.612 |
| 5.577859999999999 | 1.62 |
| 5.5810699999999995 | 1.625 |
| 5.58429 | 1.62 |
| 5.58751 | 1.614 |
| 5.59073 | 1.608 |
| 5.59394 | 1.601 |
| 5.59716 | 1.601 |
| 5.60038 | 1.601 |
| 5.6035900000000005 | 1.602 |
| 5.60681 | 1.604 |
| 5.61003 | 1.606 |
| 5.613239999999999 | 1.609 |
| 5.61646 | 1.611 |
| 5.619680000000001 | 1.614 |
| 5.62289 | 1.619 |
| 5.62611 | 1.627 |
| 5.6293299999999995 | 1.638 |
| 5.63254 | 1.653 |
| 5.63576 | 1.671 |
| 5.638979999999999 | 1.686 |
| 5.642189999999999 | 1.7 |
| 5.64541 | 1.7 |
| 5.64863 | 1.698 |
| 5.65184 | 1.687 |
| 5.655060000000001 | 1.675 |
| 5.6582799999999995 | 1.666 |
| 5.66149 | 1.658 |
| 5.66471 | 1.657 |
| 5.66793 | 1.658 |
| 5.67114 | 1.664 |
| 5.67436 | 1.67 |
| 5.67758 | 1.675 |
| 5.68079 | 1.679 |
| 5.68401 | 1.681 |
| 5.68723 | 1.682 |
| 5.69044 | 1.683 |
| 5.6936599999999995 | 1.686 |
| 5.69688 | 1.69 |
| 5.7001 | 1.697 |
| 5.70331 | 1.708 |
| 5.70653 | 1.72 |
| 5.70975 | 1.733 |
| 5.71296 | 1.741 |
| 5.7161800000000005 | 1.745 |
| 5.719399999999999 | 1.743 |
| 5.7226099999999995 | 1.738 |
| 5.72583 | 1.734 |
| 5.72905 | 1.73 |
| 5.73226 | 1.731 |
| 5.73548 | 1.733 |
| 5.7387 | 1.739 |
| 5.74191 | 1.746 |
| 5.7451300000000005 | 1.753 |
| 5.74835 | 1.759 |
| 5.7515600000000004 | 1.769 |
| 5.754779999999999 | 1.78 |
| 5.758 | 1.798 |
| 5.76121 | 1.818 |
| 5.76443 | 1.832 |
| 5.76765 | 1.844 |
| 5.77086 | 1.833 |
| 5.77408 | 1.819 |
| 5.7773 | 1.795 |
| 5.7805100000000005 | 1.77 |
| 5.783729999999999 | 1.753 |
| 5.78695 | 1.737 |
| 5.79016 | 1.73 |
| 5.79338 | 1.724 |
| 5.796600000000001 | 1.725 |
| 5.799810000000001 | 1.726 |
| 5.80303 | 1.735 |
| 5.80625 | 1.746 |
| 5.80946 | 1.769 |
| 5.81268 | 1.794 |
| 5.8159 | 1.823 |
| 5.81912 | 1.853 |
| 5.82233 | 1.866 |
| 5.82555 | 1.874 |
| 5.8287700000000005 | 1.862 |
| 5.83198 | 1.843 |
| 5.8351999999999995 | 1.821 |
| 5.83842 | 1.798 |
| 5.84163 | 1.783 |
| 5.84485 | 1.772 |
| 5.84807 | 1.771 |
| 5.85128 | 1.776 |
| 5.8545 | 1.785 |
| 5.8577200000000005 | 1.797 |
| 5.860930000000001 | 1.812 |
| 5.8641499999999995 | 1.827 |
| 5.86737 | 1.847 |
| 5.87058 | 1.872 |
| 5.8738 | 1.898 |
| 5.877020000000001 | 1.927 |
| 5.880229999999999 | 1.952 |
| 5.88345 | 1.965 |
| 5.8866700000000005 | 1.972 |
| 5.88988 | 1.961 |
| 5.8931000000000004 | 1.948 |
| 5.896319999999999 | 1.923 |
| 5.8995299999999995 | 1.898 |
| 5.90275 | 1.871 |
| 5.90597 | 1.843 |
| 5.90918 | 1.827 |
| 5.9124 | 1.81 |
| 5.91562 | 1.811 |
| 5.91883 | 1.814 |
| 5.9220500000000005 | 1.833 |
| 5.92527 | 1.855 |
| 5.9284799999999995 | 1.884 |
| 5.9317 | 1.916 |
| 5.93492 | 1.934 |
| 5.938140000000001 | 1.944 |
| 5.941350000000001 | 1.938 |
| 5.94457 | 1.914 |
| 5.94779 | 1.891 |
| 5.951 | 1.867 |
| 5.95422 | 1.848 |
| 5.957439999999999 | 1.846 |
| 5.960649999999999 | 1.845 |
| 5.96387 | 1.856 |
| 5.96709 | 1.867 |
| 5.9703 | 1.875 |
| 5.973520000000001 | 1.883 |
| 5.9767399999999995 | 1.887 |
| 5.97995 | 1.89 |
| 5.98317 | 1.893 |
| 5.98639 | 1.895 |
| 5.9896 | 1.893 |
| 5.99282 | 1.887 |
| 5.99604 | 1.879 |
| 5.99925 | 1.868 |
| 6.002470000000001 | 1.859 |
| 6.0056899999999995 | 1.856 |
| 6.0089 | 1.853 |
| 6.0121199999999995 | 1.854 |
| 6.01534 | 1.855 |
| 6.01855 | 1.853 |
| 6.02177 | 1.85 |
| 6.02499 | 1.852 |
| 6.0282 | 1.855 |
| 6.03142 | 1.874 |
| 6.0346400000000004 | 1.903 |
| 6.037850000000001 | 1.942 |
| 6.0410699999999995 | 1.996 |
| 6.04429 | 2.046 |
| 6.0475 | 2.077 |
| 6.05072 | 2.109 |
| 6.05394 | 2.09 |
| 6.05716 | 2.072 |
| 6.06037 | 2.05 |
| 6.0635900000000005 | 2.027 |
| 6.06681 | 2.014 |
| 6.07002 | 2.008 |
| 6.07324 | 2.001 |
| 6.07646 | 1.991 |
| 6.07967 | 1.98 |
| 6.08289 | 1.961 |
| 6.08611 | 1.943 |
| 6.08932 | 1.935 |
| 6.09254 | 1.928 |
| 6.09576 | 1.936 |
| 6.0989700000000004 | 1.95 |
| 6.102189999999999 | 1.971 |
| 6.10541 | 1.999 |
| 6.10862 | 2.024 |
| 6.11184 | 2.04 |
| 6.115060000000001 | 2.054 |
| 6.118270000000001 | 2.041 |
| 6.12149 | 2.028 |
| 6.12471 | 2.01 |
| 6.1279200000000005 | 1.99 |
| 6.13114 | 1.979 |
| 6.13436 | 1.974 |
| 6.137569999999999 | 1.973 |
| 6.14079 | 1.981 |
| 6.144010000000001 | 1.989 |
| 6.14722 | 1.999 |
| 6.15044 | 2.01 |
| 6.1536599999999995 | 2.017 |
| 6.15687 | 2.022 |
| 6.16009 | 2.025 |
| 6.16331 | 2.024 |
| 6.16652 | 2.024 |
| 6.16974 | 2.027 |
| 6.17296 | 2.03 |
| 6.1761800000000004 | 2.042 |
| 6.179390000000001 | 2.055 |
| 6.1826099999999995 | 2.063 |
| 6.18583 | 2.068 |
| 6.18904 | 2.066 |
| 6.19226 | 2.051 |
| 6.19548 | 2.036 |
| 6.19869 | 2.019 |
| 6.20191 | 2.002 |
| 6.2051300000000005 | 1.993 |
| 6.20834 | 1.987 |
| 6.21156 | 1.983 |
| 6.214779999999999 | 1.982 |
| 6.2179899999999995 | 1.981 |
| 6.22121 | 1.979 |
| 6.22443 | 1.978 |
| 6.22764 | 1.977 |
| 6.23086 | 1.975 |
| 6.23408 | 1.974 |
| 6.23729 | 1.973 |
| 6.2405100000000004 | 1.971 |
| 6.243729999999999 | 1.97 |
| 6.2469399999999995 | 1.968 |
| 6.25016 | 1.967 |
| 6.25338 | 1.967 |
| 6.25659 | 1.967 |
| 6.259810000000001 | 1.969 |
| 6.26303 | 1.97 |
| 6.26624 | 1.973 |
| 6.2694600000000005 | 1.977 |
| 6.27268 | 1.981 |
| 6.27589 | 1.986 |
| 6.279109999999999 | 1.991 |
| 6.28233 | 1.997 |
| 6.28554 | 2.004 |
| 6.28876 | 2.011 |
| 6.29198 | 2.019 |
| 6.2951999999999995 | 2.027 |
| 6.29841 | 2.035 |
| 6.30163 | 2.042 |
| 6.30485 | 2.049 |
| 6.30806 | 2.055 |
| 6.31128 | 2.061 |
| 6.3145 | 2.066 |
| 6.31771 | 2.072 |
| 6.320930000000001 | 2.08 |
| 6.3241499999999995 | 2.088 |
| 6.32736 | 2.104 |
| 6.33058 | 2.12 |
| 6.3338 | 2.142 |
| 6.33701 | 2.166 |
| 6.340229999999999 | 2.186 |
| 6.34345 | 2.197 |
| 6.34666 | 2.209 |
| 6.34988 | 2.205 |
| 6.3531 | 2.199 |
| 6.356310000000001 | 2.196 |
| 6.3595299999999995 | 2.193 |
| 6.36275 | 2.192 |
| 6.36596 | 2.198 |
| 6.36918 | 2.204 |
| 6.3724 | 2.207 |
| 6.37561 | 2.209 |
| 6.37883 | 2.21 |
| 6.3820500000000004 | 2.208 |
| 6.385260000000001 | 2.205 |
| 6.3884799999999995 | 2.213 |
| 6.3917 | 2.224 |
| 6.394909999999999 | 2.243 |
| 6.39813 | 2.283 |
| 6.401350000000001 | 2.322 |
| 6.40457 | 2.378 |
| 6.40778 | 2.436 |
| 6.411 | 2.481 |
| 6.41422 | 2.506 |
| 6.41743 | 2.53 |
| 6.420649999999999 | 2.502 |
| 6.42387 | 2.47 |
| 6.42708 | 2.434 |
| 6.4303 | 2.391 |
| 6.433520000000001 | 2.349 |
| 6.43673 | 2.322 |
| 6.43995 | 2.296 |
| 6.44317 | 2.277 |
| 6.44638 | 2.266 |
| 6.4496 | 2.254 |
| 6.45282 | 2.253 |
| 6.45603 | 2.252 |
| 6.45925 | 2.259 |
| 6.462470000000001 | 2.271 |
| 6.46568 | 2.284 |
| 6.4689 | 2.315 |
| 6.47212 | 2.345 |
| 6.47533 | 2.383 |
| 6.47855 | 2.428 |
| 6.48177 | 2.473 |
| 6.484979999999999 | 2.507 |
| 6.4882 | 2.54 |
| 6.49142 | 2.554 |
| 6.49463 | 2.544 |
| 6.497850000000001 | 2.533 |
| 6.5010699999999995 | 2.498 |
| 6.50428 | 2.462 |
| 6.5075 | 2.43 |
| 6.51072 | 2.406 |
| 6.51393 | 2.383 |
| 6.51715 | 2.373 |
| 6.52037 | 2.366 |
| 6.52359 | 2.359 |
| 6.526800000000001 | 2.354 |
| 6.53002 | 2.349 |
| 6.53324 | 2.348 |
| 6.536449999999999 | 2.348 |
| 6.53967 | 2.35 |
| 6.542890000000001 | 2.362 |
| 6.5461 | 2.374 |
| 6.54932 | 2.391 |
| 6.55254 | 2.411 |
| 6.55575 | 2.431 |
| 6.55897 | 2.454 |
| 6.562189999999999 | 2.477 |
| 6.5653999999999995 | 2.497 |
| 6.56862 | 2.513 |
| 6.57184 | 2.528 |
| 6.57505 | 2.528 |
| 6.578270000000001 | 2.526 |
| 6.58149 | 2.52 |
| 6.5847 | 2.505 |
| 6.58792 | 2.491 |
| 6.59114 | 2.476 |
| 6.59435 | 2.462 |
| 6.597569999999999 | 2.447 |
| 6.60079 | 2.439 |
| 6.604 | 2.43 |
| 6.60722 | 2.428 |
| 6.61044 | 2.434 |
| 6.61365 | 2.439 |
| 6.61687 | 2.463 |
| 6.62009 | 2.489 |
| 6.6233 | 2.519 |
| 6.62652 | 2.557 |
| 6.62974 | 2.595 |
| 6.63295 | 2.617 |
| 6.63617 | 2.627 |
| 6.639390000000001 | 2.637 |
| 6.6426099999999995 | 2.605 |
| 6.64582 | 2.572 |
| 6.64904 | 2.539 |
| 6.65226 | 2.504 |
| 6.65547 | 2.47 |
| 6.65869 | 2.454 |
| 6.66191 | 2.448 |
| 6.66512 | 2.442 |
| 6.66834 | 2.456 |
| 6.67156 | 2.469 |
| 6.6747700000000005 | 2.481 |
| 6.677989999999999 | 2.489 |
| 6.68121 | 2.497 |
| 6.68442 | 2.497 |
| 6.68764 | 2.493 |
| 6.69086 | 2.489 |
| 6.69407 | 2.488 |
| 6.69729 | 2.487 |
| 6.70051 | 2.489 |
| 6.703720000000001 | 2.498 |
| 6.7069399999999995 | 2.507 |
| 6.71016 | 2.514 |
| 6.71337 | 2.52 |
| 6.71659 | 2.525 |
| 6.719810000000001 | 2.519 |
| 6.72302 | 2.512 |
| 6.72624 | 2.504 |
| 6.72946 | 2.493 |
| 6.73267 | 2.482 |
| 6.73589 | 2.474 |
| 6.739109999999999 | 2.469 |
| 6.742319999999999 | 2.465 |
| 6.74554 | 2.466 |
| 6.74876 | 2.469 |
| 6.75197 | 2.472 |
| 6.75519 | 2.481 |
| 6.75841 | 2.491 |
| 6.76163 | 2.503 |
| 6.76484 | 2.521 |
| 6.76806 | 2.54 |
| 6.77128 | 2.561 |
| 6.77449 | 2.586 |
| 6.77771 | 2.611 |
| 6.780930000000001 | 2.629 |
| 6.784140000000001 | 2.645 |
| 6.78736 | 2.661 |
| 6.79058 | 2.653 |
| 6.7937899999999996 | 2.646 |
| 6.79701 | 2.634 |
| 6.80023 | 2.613 |
| 6.803439999999999 | 2.592 |
| 6.80666 | 2.576 |
| 6.80988 | 2.566 |
| 6.81309 | 2.556 |
| 6.8163100000000005 | 2.556 |
| 6.819529999999999 | 2.56 |
| 6.82274 | 2.564 |
| 6.82596 | 2.567 |
| 6.82918 | 2.571 |
| 6.83239 | 2.575 |
| 6.83561 | 2.581 |
| 6.83883 | 2.587 |
| 6.84204 | 2.599 |
| 6.845260000000001 | 2.623 |
| 6.8484799999999995 | 2.646 |
| 6.85169 | 2.673 |
| 6.85491 | 2.705 |
| 6.85813 | 2.736 |
| 6.86134 | 2.748 |
| 6.86456 | 2.752 |
| 6.86778 | 2.756 |
| 6.87099 | 2.733 |
| 6.87421 | 2.706 |
| 6.87743 | 2.679 |
| 6.880649999999999 | 2.657 |
| 6.883859999999999 | 2.634 |
| 6.88708 | 2.615 |
| 6.8903 | 2.61 |
| 6.89351 | 2.606 |
| 6.89673 | 2.604 |
| 6.89995 | 2.607 |
| 6.90316 | 2.61 |
| 6.90638 | 2.611 |
| 6.9096 | 2.61 |
| 6.91281 | 2.61 |
| 6.91603 | 2.608 |
| 6.91925 | 2.605 |
| 6.92246 | 2.602 |
| 6.925680000000001 | 2.602 |
| 6.9289 | 2.604 |
| 6.93211 | 2.605 |
| 6.9353299999999996 | 2.616 |
| 6.93855 | 2.629 |
| 6.94176 | 2.641 |
| 6.944979999999999 | 2.663 |
| 6.9482 | 2.686 |
| 6.95141 | 2.708 |
| 6.95463 | 2.726 |
| 6.9578500000000005 | 2.745 |
| 6.961060000000001 | 2.759 |
| 6.96428 | 2.759 |
| 6.9675 | 2.759 |
| 6.97071 | 2.757 |
| 6.97393 | 2.75 |
| 6.97715 | 2.742 |
| 6.980359999999999 | 2.738 |
| 6.98358 | 2.737 |
| 6.986800000000001 | 2.737 |
| 6.99001 | 2.739 |
| 6.99323 | 2.744 |
| 6.996449999999999 | 2.749 |
| 6.99967 | 2.755 |
| 7.00288 | 2.76 |
| 7.0061 | 2.766 |
| 7.00932 | 2.773 |
| 7.01253 | 2.781 |
| 7.01575 | 2.789 |
| 7.01897 | 2.801 |
| 7.0221800000000005 | 2.815 |
| 7.025399999999999 | 2.83 |
| 7.02862 | 2.849 |
| 7.03183 | 2.871 |
| 7.03505 | 2.893 |
| 7.038270000000001 | 2.912 |
| 7.04148 | 2.93 |
| 7.0447 | 2.948 |
| 7.04792 | 2.952 |
| 7.05113 | 2.951 |
| 7.05435 | 2.951 |
| 7.05757 | 2.941 |
| 7.060779999999999 | 2.929 |
| 7.064 | 2.917 |
| 7.06722 | 2.909 |
| 7.07043 | 2.903 |
| 7.07365 | 2.897 |
| 7.0768699999999995 | 2.898 |
| 7.08008 | 2.901 |
| 7.0833 | 2.904 |
| 7.08652 | 2.911 |
| 7.089729999999999 | 2.919 |
| 7.09295 | 2.926 |
| 7.09617 | 2.936 |
| 7.09938 | 2.947 |
| 7.102600000000001 | 2.957 |
| 7.10582 | 2.968 |
| 7.10903 | 2.98 |
| 7.11225 | 2.991 |
| 7.11547 | 3.001 |
| 7.11869 | 3.011 |
| 7.121899999999999 | 3.02 |
| 7.12512 | 3.03 |
| 7.128340000000001 | 3.041 |
| 7.13155 | 3.051 |
| 7.1347700000000005 | 3.064 |
| 7.137989999999999 | 3.079 |
| 7.1411999999999995 | 3.093 |
| 7.14442 | 3.109 |
| 7.14764 | 3.124 |
| 7.15085 | 3.14 |
| 7.15407 | 3.154 |
| 7.15729 | 3.166 |
| 7.1605 | 3.178 |
| 7.1637200000000005 | 3.186 |
| 7.166939999999999 | 3.191 |
| 7.17015 | 3.195 |
| 7.17337 | 3.197 |
| 7.17659 | 3.196 |
| 7.1798 | 3.195 |
| 7.183020000000001 | 3.196 |
| 7.18624 | 3.199 |
| 7.18945 | 3.202 |
| 7.19267 | 3.207 |
| 7.19589 | 3.218 |
| 7.1991000000000005 | 3.228 |
| 7.202319999999999 | 3.238 |
| 7.20554 | 3.247 |
| 7.20875 | 3.255 |
| 7.21197 | 3.263 |
| 7.21519 | 3.265 |
| 7.2184 | 3.267 |
| 7.22162 | 3.269 |
| 7.22484 | 3.271 |
| 7.22806 | 3.274 |
| 7.23127 | 3.276 |
| 7.23449 | 3.282 |
| 7.23771 | 3.288 |
| 7.24092 | 3.295 |
| 7.244140000000001 | 3.305 |
| 7.24736 | 3.316 |
| 7.25057 | 3.327 |
| 7.25379 | 3.34 |
| 7.25701 | 3.354 |
| 7.26022 | 3.369 |
| 7.263439999999999 | 3.383 |
| 7.26666 | 3.397 |
| 7.26987 | 3.411 |
| 7.27309 | 3.425 |
| 7.2763100000000005 | 3.434 |
| 7.279520000000001 | 3.442 |
| 7.2827399999999995 | 3.451 |
| 7.28596 | 3.456 |
| 7.28917 | 3.46 |
| 7.29239 | 3.465 |
| 7.29561 | 3.471 |
| 7.29882 | 3.476 |
| 7.30204 | 3.482 |
| 7.3052600000000005 | 3.49 |
| 7.308470000000001 | 3.5 |
| 7.31169 | 3.51 |
| 7.31491 | 3.521 |
| 7.3181199999999995 | 3.536 |
| 7.32134 | 3.55 |
| 7.32456 | 3.565 |
| 7.32777 | 3.582 |
| 7.33099 | 3.599 |
| 7.33421 | 3.615 |
| 7.33742 | 3.628 |
| 7.3406400000000005 | 3.641 |
| 7.343859999999999 | 3.654 |
| 7.34708 | 3.662 |
| 7.35029 | 3.669 |
| 7.35351 | 3.676 |
| 7.35673 | 3.682 |
| 7.35994 | 3.689 |
| 7.36316 | 3.695 |
| 7.36638 | 3.703 |
| 7.3695900000000005 | 3.712 |
| 7.37281 | 3.722 |
| 7.37603 | 3.732 |
| 7.379239999999999 | 3.743 |
| 7.38246 | 3.755 |
| 7.385680000000001 | 3.766 |
| 7.38889 | 3.779 |
| 7.39211 | 3.791 |
| 7.3953299999999995 | 3.804 |
| 7.39854 | 3.816 |
| 7.40176 | 3.83 |
| 7.404979999999999 | 3.843 |
| 7.408189999999999 | 3.857 |
| 7.41141 | 3.87 |
| 7.41463 | 3.884 |
| 7.41784 | 3.898 |
| 7.421060000000001 | 3.912 |
| 7.4242799999999995 | 3.926 |
| 7.42749 | 3.94 |
| 7.43071 | 3.955 |
| 7.43393 | 3.972 |
| 7.43714 | 3.988 |
| 7.44036 | 4.005 |
| 7.44358 | 4.025 |
| 7.44679 | 4.045 |
| 7.45001 | 4.065 |
| 7.45323 | 4.086 |
| 7.45644 | 4.107 |
| 7.4596599999999995 | 4.128 |
| 7.46288 | 4.147 |
| 7.4661 | 4.165 |
| 7.46931 | 4.182 |
| 7.47253 | 4.198 |
| 7.47575 | 4.211 |
| 7.47896 | 4.224 |
| 7.4821800000000005 | 4.236 |
| 7.485399999999999 | 4.249 |
| 7.4886099999999995 | 4.261 |
| 7.49183 | 4.273 |
| 7.49505 | 4.286 |
| 7.49826 | 4.301 |
| 7.50148 | 4.316 |
| 7.5047 | 4.331 |
| 7.50791 | 4.348 |
| 7.5111300000000005 | 4.365 |
| 7.51435 | 4.382 |
| 7.5175600000000005 | 4.4 |
| 7.520779999999999 | 4.418 |
| 7.524 | 4.436 |
| 7.52721 | 4.455 |
| 7.53043 | 4.473 |
| 7.53365 | 4.492 |
| 7.53686 | 4.51 |
| 7.54008 | 4.53 |
| 7.5433 | 4.55 |
| 7.5465100000000005 | 4.569 |
| 7.549729999999999 | 4.59 |
| 7.55295 | 4.612 |
| 7.55616 | 4.634 |
| 7.55938 | 4.656 |
| 7.562600000000001 | 4.68 |
| 7.565810000000001 | 4.705 |
| 7.56903 | 4.729 |
| 7.57225 | 4.754 |
| 7.57546 | 4.778 |
| 7.57868 | 4.803 |
| 7.581899999999999 | 4.828 |
| 7.58512 | 4.852 |
| 7.58833 | 4.875 |
| 7.59155 | 4.899 |
| 7.5947700000000005 | 4.922 |
| 7.59798 | 4.946 |
| 7.6011999999999995 | 4.97 |
| 7.60442 | 4.994 |
| 7.60763 | 5.018 |
| 7.61085 | 5.043 |
| 7.61407 | 5.068 |
| 7.61728 | 5.094 |
| 7.6205 | 5.119 |
| 7.6237200000000005 | 5.145 |
| 7.626930000000001 | 5.171 |
| 7.6301499999999995 | 5.197 |
| 7.63337 | 5.223 |
| 7.63658 | 5.249 |
| 7.6398 | 5.276 |
| 7.643020000000001 | 5.303 |
| 7.646229999999999 | 5.33 |
| 7.64945 | 5.358 |
| 7.65267 | 5.387 |
| 7.65588 | 5.415 |
| 7.6591000000000005 | 5.444 |
| 7.662319999999999 | 5.475 |
| 7.6655299999999995 | 5.505 |
| 7.66875 | 5.536 |
| 7.67197 | 5.567 |
| 7.67518 | 5.598 |
| 7.6784 | 5.63 |
| 7.68162 | 5.662 |
| 7.68483 | 5.694 |
| 7.6880500000000005 | 5.727 |
| 7.69127 | 5.76 |
| 7.6944799999999995 | 5.793 |
| 7.6977 | 5.827 |
| 7.70092 | 5.862 |
| 7.704140000000001 | 5.896 |
| 7.70735 | 5.931 |
| 7.71057 | 5.967 |
| 7.71379 | 6.004 |
| 7.717 | 6.04 |
| 7.72022 | 6.077 |
| 7.723439999999999 | 6.114 |
| 7.726649999999999 | 6.151 |
| 7.72987 | 6.189 |
| 7.73309 | 6.228 |
| 7.7363 | 6.266 |
| 7.739520000000001 | 6.305 |
| 7.7427399999999995 | 6.344 |
| 7.74595 | 6.384 |
| 7.74917 | 6.424 |
| 7.75239 | 6.464 |
| 7.7556 | 6.505 |
| 7.75882 | 6.547 |
| 7.76204 | 6.588 |
| 7.76525 | 6.63 |
| 7.768470000000001 | 6.672 |
| 7.7716899999999995 | 6.714 |
| 7.7749 | 6.757 |
| 7.7781199999999995 | 6.801 |
| 7.78134 | 6.846 |
| 7.78455 | 6.89 |
| 7.78777 | 6.936 |
| 7.79099 | 6.983 |
| 7.7942 | 7.03 |
| 7.79742 | 7.077 |
| 7.8006400000000005 | 7.126 |
| 7.803850000000001 | 7.176 |
| 7.8070699999999995 | 7.226 |
| 7.81029 | 7.277 |
| 7.8135 | 7.329 |
| 7.81672 | 7.381 |
| 7.81994 | 7.434 |
| 7.82316 | 7.487 |
| 7.82637 | 7.542 |
| 7.8295900000000005 | 7.596 |
| 7.83281 | 7.65 |
| 7.83602 | 7.706 |
| 7.83924 | 7.763 |
| 7.84246 | 7.819 |
| 7.84567 | 7.876 |
| 7.84889 | 7.933 |
| 7.85211 | 7.991 |
| 7.85532 | 8.049 |
| 7.85854 | 8.108 |
| 7.86176 | 8.166 |
| 7.8649700000000005 | 8.225 |
| 7.868189999999999 | 8.284 |
| 7.87141 | 8.343 |
| 7.87462 | 8.402 |
| 7.87784 | 8.461 |
| 7.881060000000001 | 8.52 |
| 7.884270000000001 | 8.579 |
| 7.88749 | 8.638 |
| 7.89071 | 8.697 |
| 7.8939200000000005 | 8.756 |
| 7.89714 | 8.816 |
| 7.90036 | 8.876 |
| 7.903569999999999 | 8.935 |
| 7.90679 | 8.996 |
| 7.910010000000001 | 9.056 |
| 7.91322 | 9.117 |
| 7.91644 | 9.178 |
| 7.9196599999999995 | 9.239 |
| 7.92287 | 9.301 |
| 7.92609 | 9.362 |
| 7.92931 | 9.424 |
| 7.93253 | 9.485 |
| 7.93574 | 9.546 |
| 7.93896 | 9.607 |
| 7.9421800000000005 | 9.668 |
| 7.945390000000001 | 9.728 |
| 7.9486099999999995 | 9.788 |
| 7.95183 | 9.848 |
| 7.95504 | 9.908 |
| 7.95826 | 9.967 |
| 7.96148 | 10.027 |
| 7.964689999999999 | 10.086 |
| 7.96791 | 10.146 |
| 7.9711300000000005 | 10.207 |
| 7.97434 | 10.267 |
| 7.97756 | 10.327 |
| 7.980779999999999 | 10.388 |
| 7.9839899999999995 | 10.449 |
| 7.98721 | 10.511 |
| 7.99043 | 10.572 |
| 7.99364 | 10.634 |
| 7.99686 | 10.696 |
| 8.00008 | 10.758 |
| 8.00329 | 10.819 |
| 8.00651 | 10.881 |
| 8.00973 | 10.943 |
| 8.01294 | 11.005 |
| 8.01616 | 11.067 |
| 8.01938 | 11.129 |
| 8.022590000000001 | 11.19 |
| 8.02581 | 11.252 |
| 8.02903 | 11.314 |
| 8.03224 | 11.376 |
| 8.03546 | 11.438 |
| 8.038680000000001 | 11.5 |
| 8.04189 | 11.562 |
| 8.04511 | 11.624 |
| 8.04833 | 11.686 |
| 8.05155 | 11.748 |
| 8.05476 | 11.809 |
| 8.057979999999999 | 11.87 |
| 8.0612 | 11.93 |
| 8.06441 | 11.991 |
| 8.06763 | 12.051 |
| 8.07085 | 12.112 |
| 8.074060000000001 | 12.172 |
| 8.07728 | 12.232 |
| 8.0805 | 12.292 |
| 8.08371 | 12.353 |
| 8.08693 | 12.414 |
| 8.09015 | 12.475 |
| 8.09336 | 12.536 |
| 8.09658 | 12.597 |
| 8.0998 | 12.659 |
| 8.10301 | 12.72 |
| 8.10623 | 12.781 |
| 8.109449999999999 | 12.842 |
| 8.11266 | 12.903 |
| 8.11588 | 12.963 |
| 8.1191 | 13.023 |
| 8.12231 | 13.082 |
| 8.12553 | 13.142 |
| 8.12875 | 13.202 |
| 8.13196 | 13.26 |
| 8.13518 | 13.319 |
| 8.138399999999999 | 13.377 |
| 8.14161 | 13.435 |
| 8.14483 | 13.493 |
| 8.14805 | 13.55 |
| 8.15126 | 13.608 |
| 8.15448 | 13.665 |
| 8.1577 | 13.722 |
| 8.16091 | 13.778 |
| 8.16413 | 13.835 |
| 8.16735 | 13.892 |
| 8.17057 | 13.948 |
| 8.173779999999999 | 14.005 |
| 8.177 | 14.061 |
| 8.18022 | 14.117 |
| 8.18343 | 14.173 |
| 8.18665 | 14.228 |
| 8.189869999999999 | 14.284 |
| 8.19308 | 14.339 |
| 8.196299999999999 | 14.393 |
| 8.19952 | 14.447 |
| 8.202729999999999 | 14.501 |
| 8.205950000000001 | 14.554 |
| 8.20917 | 14.605 |
| 8.21238 | 14.657 |
| 8.2156 | 14.708 |
| 8.21882 | 14.759 |
| 8.22203 | 14.809 |
| 8.22525 | 14.858 |
| 8.22847 | 14.908 |
| 8.23168 | 14.957 |
| 8.2349 | 15.005 |
| 8.23812 | 15.053 |
| 8.24133 | 15.101 |
| 8.244549999999998 | 15.148 |
| 8.247770000000001 | 15.195 |
| 8.25098 | 15.242 |
| 8.2542 | 15.288 |
| 8.25742 | 15.335 |
| 8.260629999999999 | 15.38 |
| 8.26385 | 15.426 |
| 8.26707 | 15.471 |
| 8.270280000000001 | 15.516 |
| 8.2735 | 15.561 |
| 8.27672 | 15.605 |
| 8.27993 | 15.65 |
| 8.28315 | 15.694 |
| 8.286370000000002 | 15.737 |
| 8.28959 | 15.781 |
| 8.2928 | 15.824 |
| 8.29602 | 15.867 |
| 8.29924 | 15.91 |
| 8.30245 | 15.953 |
| 8.30567 | 15.995 |
| 8.30889 | 16.037 |
| 8.312100000000001 | 16.08 |
| 8.31532 | 16.122 |
| 8.31854 | 16.163 |
| 8.32175 | 16.205 |
| 8.324969999999999 | 16.247 |
| 8.328190000000001 | 16.288 |
| 8.3314 | 16.33 |
| 8.334620000000001 | 16.371 |
| 8.33784 | 16.412 |
| 8.34105 | 16.452 |
| 8.34427 | 16.493 |
| 8.34749 | 16.533 |
| 8.350700000000002 | 16.573 |
| 8.35392 | 16.613 |
| 8.35714 | 16.652 |
| 8.36035 | 16.692 |
| 8.36357 | 16.731 |
| 8.366790000000002 | 16.771 |
| 8.37 | 16.81 |
| 8.37322 | 16.85 |
| 8.37644 | 16.89 |
| 8.37965 | 16.93 |
| 8.38287 | 16.97 |
| 8.38609 | 17.01 |
| 8.389299999999999 | 17.05 |
| 8.392520000000001 | 17.09 |
| 8.39574 | 17.13 |
| 8.398950000000001 | 17.17 |
| 8.40217 | 17.21 |
| 8.405389999999999 | 17.249 |
| 8.408610000000001 | 17.288 |
| 8.41182 | 17.328 |
| 8.415040000000001 | 17.367 |
| 8.41826 | 17.406 |
| 8.42147 | 17.444 |
| 8.42469 | 17.482 |
| 8.42791 | 17.521 |
| 8.43112 | 17.559 |
| 8.43434 | 17.596 |
| 8.43756 | 17.634 |
| 8.44077 | 17.671 |
| 8.44399 | 17.709 |
| 8.447209999999998 | 17.746 |
| 8.45042 | 17.784 |
| 8.45364 | 17.822 |
| 8.45686 | 17.86 |
| 8.46007 | 17.897 |
| 8.46329 | 17.936 |
| 8.46651 | 17.974 |
| 8.469719999999999 | 18.013 |
| 8.472940000000001 | 18.051 |
| 8.47616 | 18.09 |
| 8.479370000000001 | 18.129 |
| 8.48259 | 18.167 |
| 8.485809999999999 | 18.206 |
| 8.48902 | 18.245 |
| 8.492239999999999 | 18.284 |
| 8.49546 | 18.323 |
| 8.49867 | 18.362 |
| 8.50189 | 18.401 |
| 8.50511 | 18.44 |
| 8.50832 | 18.48 |
| 8.51154 | 18.519 |
| 8.51476 | 18.558 |
| 8.51797 | 18.598 |
| 8.52119 | 18.637 |
| 8.52441 | 18.676 |
| 8.527629999999998 | 18.716 |
| 8.53084 | 18.756 |
| 8.53406 | 18.796 |
| 8.53728 | 18.836 |
| 8.54049 | 18.875 |
| 8.543709999999999 | 18.915 |
| 8.54693 | 18.956 |
| 8.550139999999999 | 18.996 |
| 8.553360000000001 | 19.037 |
| 8.55658 | 19.077 |
| 8.559790000000001 | 19.118 |
| 8.56301 | 19.159 |
| 8.56623 | 19.2 |
| 8.56944 | 19.242 |
| 8.572659999999999 | 19.283 |
| 8.57588 | 19.326 |
| 8.57909 | 19.368 |
| 8.58231 | 19.41 |
| 8.58553 | 19.453 |
| 8.58874 | 19.496 |
| 8.591959999999998 | 19.54 |
| 8.595180000000001 | 19.583 |
| 8.59839 | 19.627 |
| 8.60161 | 19.671 |
| 8.60483 | 19.716 |
| 8.60804 | 19.76 |
| 8.61126 | 19.804 |
| 8.61448 | 19.849 |
| 8.61769 | 19.894 |
| 8.62091 | 19.939 |
| 8.62413 | 19.984 |
| 8.62734 | 20.03 |
| 8.63056 | 20.075 |
| 8.63378 | 20.121 |
| 8.637 | 20.167 |
| 8.64021 | 20.213 |
| 8.64343 | 20.26 |
| 8.64665 | 20.307 |
| 8.64986 | 20.354 |
| 8.65308 | 20.402 |
| 8.6563 | 20.449 |
| 8.659510000000001 | 20.496 |
| 8.66273 | 20.544 |
| 8.66595 | 20.592 |
| 8.66916 | 20.64 |
| 8.672379999999999 | 20.688 |
| 8.675600000000001 | 20.736 |
| 8.67881 | 20.784 |
| 8.682030000000001 | 20.833 |
| 8.68525 | 20.881 |
| 8.68846 | 20.93 |
| 8.69168 | 20.979 |
| 8.6949 | 21.029 |
| 8.69811 | 21.078 |
| 8.70133 | 21.128 |
| 8.70455 | 21.181 |
| 8.70776 | 21.233 |
| 8.71098 | 21.285 |
| 8.7142 | 21.337 |
| 8.71741 | 21.391 |
| 8.72063 | 21.446 |
| 8.72385 | 21.5 |
| 8.72706 | 21.555 |
| 8.73028 | 21.61 |
| 8.7335 | 21.667 |
| 8.736709999999999 | 21.724 |
| 8.739930000000001 | 21.781 |
| 8.74315 | 21.838 |
| 8.746360000000001 | 21.896 |
| 8.74958 | 21.954 |
| 8.752799999999999 | 22.013 |
| 8.756020000000001 | 22.072 |
| 8.759229999999999 | 22.13 |
| 8.762450000000001 | 22.191 |
| 8.76567 | 22.251 |
| 8.76888 | 22.312 |
| 8.7721 | 22.372 |
| 8.775319999999999 | 22.434 |
| 8.77853 | 22.498 |
| 8.78175 | 22.561 |
| 8.78497 | 22.624 |
| 8.78818 | 22.688 |
| 8.7914 | 22.754 |
| 8.79462 | 22.82 |
| 8.79783 | 22.887 |
| 8.80105 | 22.953 |
| 8.80427 | 23.02 |
| 8.80748 | 23.089 |
| 8.8107 | 23.159 |
| 8.81392 | 23.228 |
| 8.817129999999999 | 23.298 |
| 8.820350000000001 | 23.369 |
| 8.82357 | 23.441 |
| 8.826780000000001 | 23.514 |
| 8.83 | 23.587 |
| 8.833219999999999 | 23.659 |
| 8.83643 | 23.736 |
| 8.839649999999999 | 23.813 |
| 8.842870000000001 | 23.89 |
| 8.84608 | 23.968 |
| 8.8493 | 24.046 |
| 8.85252 | 24.129 |
| 8.85573 | 24.212 |
| 8.85895 | 24.294 |
| 8.86217 | 24.377 |
| 8.86538 | 24.463 |
| 8.8686 | 24.552 |
| 8.87182 | 24.64 |
| 8.87504 | 24.729 |
| 8.87825 | 24.818 |
| 8.88147 | 24.911 |
| 8.88469 | 25.006 |
| 8.8879 | 25.1 |
| 8.89112 | 25.195 |
| 8.89434 | 25.29 |
| 8.897549999999999 | 25.39 |
| 8.90077 | 25.491 |
| 8.90399 | 25.592 |
| 8.907200000000001 | 25.693 |
| 8.91042 | 25.796 |
| 8.91364 | 25.904 |
| 8.91685 | 26.012 |
| 8.920069999999999 | 26.12 |
| 8.923290000000001 | 26.228 |
| 8.9265 | 26.339 |
| 8.92972 | 26.454 |
| 8.93294 | 26.57 |
| 8.93615 | 26.685 |
| 8.93937 | 26.8 |
| 8.942590000000001 | 26.92 |
| 8.945799999999998 | 27.043 |
| 8.94902 | 27.165 |
| 8.95224 | 27.288 |
| 8.95545 | 27.41 |
| 8.95867 | 27.54 |
| 8.961889999999999 | 27.67 |
| 8.9651 | 27.801 |
| 8.96832 | 27.931 |
| 8.971540000000001 | 28.062 |
| 8.97475 | 28.201 |
| 8.97797 | 28.34 |
| 8.98119 | 28.479 |
| 8.984399999999999 | 28.617 |
| 8.987620000000001 | 28.758 |
| 8.99084 | 28.904 |
| 8.99406 | 29.05 |
| 8.99727 | 29.196 |
| 9.00049 | 29.342 |
| 9.00371 | 29.49 |
| 9.006920000000001 | 29.642 |
| 9.01014 | 29.793 |
| 9.01336 | 29.944 |
| 9.01657 | 30.096 |
| 9.01979 | 30.249 |
| 9.023010000000001 | 30.404 |
| 9.026219999999999 | 30.559 |
| 9.029440000000001 | 30.714 |
| 9.03266 | 30.868 |
| 9.035870000000001 | 31.024 |
| 9.03909 | 31.179 |
| 9.042309999999999 | 31.335 |
| 9.04552 | 31.49 |
| 9.04874 | 31.645 |
| 9.05196 | 31.799 |
| 9.05517 | 31.952 |
| 9.05839 | 32.105 |
| 9.06161 | 32.258 |
| 9.06482 | 32.41 |
| 9.068040000000002 | 32.559 |
| 9.07126 | 32.707 |
| 9.07447 | 32.854 |
| 9.07769 | 33.002 |
| 9.08091 | 33.149 |
| 9.08412 | 33.289 |
| 9.08734 | 33.429 |
| 9.09056 | 33.568 |
| 9.093770000000001 | 33.707 |
| 9.09699 | 33.846 |
| 9.100209999999999 | 33.975 |
| 9.10342 | 34.103 |
| 9.106639999999999 | 34.231 |
| 9.109860000000001 | 34.359 |
| 9.11308 | 34.486 |
| 9.116290000000001 | 34.601 |
| 9.11951 | 34.715 |
| 9.122729999999999 | 34.828 |
| 9.12594 | 34.942 |
| 9.12916 | 35.055 |
| 9.13238 | 35.154 |
| 9.13559 | 35.251 |
| 9.13881 | 35.348 |
| 9.14203 | 35.446 |
| 9.14524 | 35.543 |
| 9.148459999999998 | 35.624 |
| 9.15168 | 35.704 |
| 9.15489 | 35.784 |
| 9.15811 | 35.864 |
| 9.16133 | 35.944 |
| 9.16454 | 36.008 |
| 9.16776 | 36.071 |
| 9.17098 | 36.134 |
| 9.174190000000001 | 36.197 |
| 9.17741 | 36.26 |
| 9.180629999999999 | 36.31 |
| 9.18384 | 36.358 |
| 9.187059999999999 | 36.406 |
| 9.190280000000001 | 36.454 |
| 9.19349 | 36.502 |
| 9.19671 | 36.539 |
| 9.19993 | 36.573 |
| 9.20314 | 36.608 |
| 9.20636 | 36.642 |
| 9.20958 | 36.677 |
| 9.21279 | 36.702 |
| 9.21601 | 36.724 |
| 9.21923 | 36.746 |
| 9.22244 | 36.768 |
| 9.22566 | 36.79 |
| 9.228879999999998 | 36.805 |
| 9.2321 | 36.816 |
| 9.23531 | 36.826 |
| 9.23853 | 36.837 |
| 9.24175 | 36.848 |
| 9.244959999999999 | 36.853 |
| 9.24818 | 36.854 |
| 9.2514 | 36.854 |
| 9.254610000000001 | 36.855 |
| 9.25783 | 36.855 |
| 9.26105 | 36.852 |
| 9.26426 | 36.844 |
| 9.267479999999999 | 36.836 |
| 9.270700000000001 | 36.827 |
| 9.273909999999999 | 36.819 |
| 9.27713 | 36.809 |
| 9.28035 | 36.794 |
| 9.28356 | 36.778 |
| 9.28678 | 36.762 |
| 9.29 | 36.747 |
| 9.293209999999998 | 36.731 |
| 9.29643 | 36.71 |
| 9.29965 | 36.689 |
| 9.30286 | 36.668 |
| 9.30608 | 36.647 |
| 9.309299999999999 | 36.626 |
| 9.31251 | 36.602 |
| 9.31573 | 36.577 |
| 9.318950000000001 | 36.552 |
| 9.32216 | 36.527 |
| 9.32538 | 36.502 |
| 9.3286 | 36.474 |
| 9.331809999999999 | 36.446 |
| 9.335030000000001 | 36.418 |
| 9.33825 | 36.389 |
| 9.34146 | 36.361 |
| 9.34468 | 36.331 |
| 9.3479 | 36.3 |
| 9.351120000000002 | 36.268 |
| 9.35433 | 36.237 |
| 9.35755 | 36.206 |
| 9.36077 | 36.174 |
| 9.36398 | 36.139 |
| 9.3672 | 36.105 |
| 9.37042 | 36.071 |
| 9.373629999999999 | 36.037 |
| 9.376850000000001 | 36.003 |
| 9.38007 | 35.966 |
| 9.383280000000001 | 35.929 |
| 9.3865 | 35.892 |
| 9.389719999999999 | 35.855 |
| 9.39293 | 35.818 |
| 9.39615 | 35.78 |
| 9.399370000000001 | 35.741 |
| 9.40258 | 35.702 |
| 9.4058 | 35.663 |
| 9.40902 | 35.624 |
| 9.41223 | 35.585 |
| 9.41545 | 35.545 |
| 9.41867 | 35.505 |
| 9.42188 | 35.465 |
| 9.4251 | 35.425 |
| 9.42832 | 35.385 |
| 9.43153 | 35.345 |
| 9.43475 | 35.305 |
| 9.43797 | 35.265 |
| 9.441180000000001 | 35.225 |
| 9.4444 | 35.185 |
| 9.44762 | 35.145 |
| 9.45083 | 35.105 |
| 9.454049999999999 | 35.066 |
| 9.457270000000001 | 35.026 |
| 9.46049 | 34.987 |
| 9.463700000000001 | 34.947 |
| 9.46692 | 34.908 |
| 9.470139999999999 | 34.87 |
| 9.47335 | 34.831 |
| 9.476569999999999 | 34.792 |
| 9.479790000000001 | 34.753 |
| 9.483 | 34.715 |
| 9.48622 | 34.677 |
| 9.48944 | 34.639 |
| 9.49265 | 34.6 |
| 9.49587 | 34.562 |
| 9.49909 | 34.524 |
| 9.5023 | 34.486 |
| 9.50552 | 34.448 |
| 9.50874 | 34.411 |
| 9.51195 | 34.373 |
| 9.51517 | 34.335 |
| 9.51839 | 34.299 |
| 9.521600000000001 | 34.263 |
| 9.52482 | 34.227 |
| 9.52804 | 34.191 |
| 9.53125 | 34.155 |
| 9.534469999999999 | 34.122 |
| 9.537690000000001 | 34.088 |
| 9.540899999999999 | 34.056 |
| 9.544120000000001 | 34.022 |
| 9.54734 | 33.989 |
| 9.55055 | 33.957 |
| 9.55377 | 33.926 |
| 9.556989999999999 | 33.894 |
| 9.5602 | 33.863 |
| 9.56342 | 33.831 |
| 9.56664 | 33.8 |
| 9.56985 | 33.769 |
| 9.57307 | 33.737 |
| 9.57629 | 33.706 |
| 9.57951 | 33.674 |
| 9.58272 | 33.643 |
| 9.58594 | 33.611 |
| 9.58916 | 33.58 |
| 9.59237 | 33.548 |
| 9.59559 | 33.517 |
| 9.59881 | 33.486 |
| 9.60202 | 33.454 |
| 9.60524 | 33.424 |
| 9.60846 | 33.394 |
| 9.61167 | 33.364 |
| 9.614889999999999 | 33.334 |
| 9.61811 | 33.304 |
| 9.621319999999999 | 33.274 |
| 9.624540000000001 | 33.247 |
| 9.62776 | 33.219 |
| 9.63097 | 33.192 |
| 9.63419 | 33.164 |
| 9.63741 | 33.137 |
| 9.64062 | 33.111 |
| 9.64384 | 33.086 |
| 9.64706 | 33.061 |
| 9.65027 | 33.036 |
| 9.65349 | 33.01 |
| 9.656709999999999 | 32.986 |
| 9.65992 | 32.961 |
| 9.66314 | 32.937 |
| 9.666360000000001 | 32.913 |
| 9.66957 | 32.888 |
| 9.67279 | 32.864 |
| 9.67601 | 32.84 |
| 9.679219999999999 | 32.815 |
| 9.68244 | 32.79 |
| 9.68566 | 32.765 |
| 9.688870000000001 | 32.74 |
| 9.69209 | 32.716 |
| 9.69531 | 32.691 |
| 9.69853 | 32.666 |
| 9.70174 | 32.642 |
| 9.70496 | 32.617 |
| 9.70818 | 32.593 |
| 9.71139 | 32.568 |
| 9.71461 | 32.545 |
| 9.71783 | 32.522 |
| 9.72104 | 32.498 |
| 9.724260000000001 | 32.475 |
| 9.72748 | 32.452 |
| 9.730690000000001 | 32.429 |
| 9.73391 | 32.406 |
| 9.737129999999999 | 32.384 |
| 9.74034 | 32.362 |
| 9.743559999999999 | 32.34 |
| 9.746780000000001 | 32.317 |
| 9.74999 | 32.296 |
| 9.75321 | 32.275 |
| 9.75643 | 32.254 |
| 9.75964 | 32.233 |
| 9.76286 | 32.212 |
| 9.76608 | 32.191 |
| 9.769290000000002 | 32.171 |
| 9.77251 | 32.152 |
| 9.77573 | 32.132 |
| 9.77894 | 32.113 |
| 9.78216 | 32.094 |
| 9.78538 | 32.075 |
| 9.788590000000001 | 32.057 |
| 9.79181 | 32.04 |
| 9.79503 | 32.022 |
| 9.79824 | 32.004 |
| 9.801459999999999 | 31.986 |
| 9.804680000000001 | 31.97 |
| 9.807889999999999 | 31.954 |
| 9.811110000000001 | 31.937 |
| 9.81433 | 31.921 |
| 9.817549999999999 | 31.905 |
| 9.82076 | 31.888 |
| 9.823979999999999 | 31.874 |
| 9.827200000000001 | 31.859 |
| 9.83041 | 31.844 |
| 9.83363 | 31.829 |
| 9.83685 | 31.814 |
| 9.84006 | 31.8 |
| 9.84328 | 31.786 |
| 9.8465 | 31.772 |
| 9.84971 | 31.758 |
| 9.85293 | 31.744 |
| 9.85615 | 31.73 |
| 9.85936 | 31.716 |
| 9.86258 | 31.701 |
| 9.8658 | 31.686 |
| 9.86901 | 31.672 |
| 9.87223 | 31.657 |
| 9.87545 | 31.642 |
| 9.87866 | 31.626 |
| 9.881879999999999 | 31.61 |
| 9.8851 | 31.594 |
| 9.888309999999999 | 31.577 |
| 9.891530000000001 | 31.561 |
| 9.89475 | 31.545 |
| 9.89796 | 31.528 |
| 9.90118 | 31.51 |
| 9.904399999999999 | 31.493 |
| 9.90761 | 31.476 |
| 9.91083 | 31.458 |
| 9.91405 | 31.441 |
| 9.91726 | 31.424 |
| 9.92048 | 31.406 |
| 9.9237 | 31.388 |
| 9.92691 | 31.37 |
| 9.930129999999998 | 31.353 |
| 9.93335 | 31.335 |
| 9.93657 | 31.317 |
| 9.93978 | 31.299 |
| 9.943 | 31.28 |
| 9.946219999999999 | 31.262 |
| 9.94943 | 31.244 |
| 9.95265 | 31.226 |
| 9.95587 | 31.206 |
| 9.95908 | 31.187 |
| 9.962299999999999 | 31.167 |
| 9.96552 | 31.148 |
| 9.968729999999999 | 31.128 |
| 9.971950000000001 | 31.108 |
| 9.97517 | 31.086 |
| 9.97838 | 31.064 |
| 9.9816 | 31.042 |
| 9.98482 | 31.02 |
| 9.98803 | 30.998 |
| 9.99125 | 30.976 |
| 9.99447 | 30.95 |
| 9.99768 | 30.925 |
| 10.0009 | 30.899 |
| 10.004100000000001 | 30.874 |
| 10.007299999999999 | 30.848 |
| 10.0106 | 30.823 |